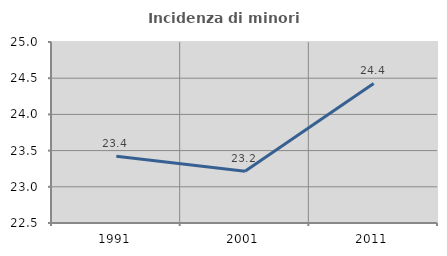
| Category | Incidenza di minori stranieri |
|---|---|
| 1991.0 | 23.423 |
| 2001.0 | 23.216 |
| 2011.0 | 24.428 |